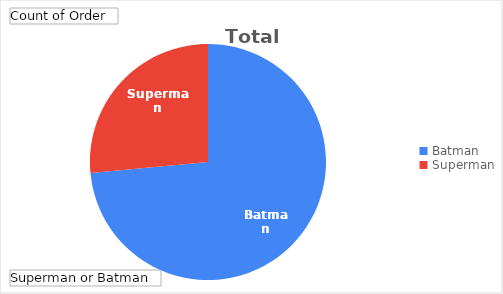
| Category | Total |
|---|---|
| Batman | 25 |
| Superman | 9 |